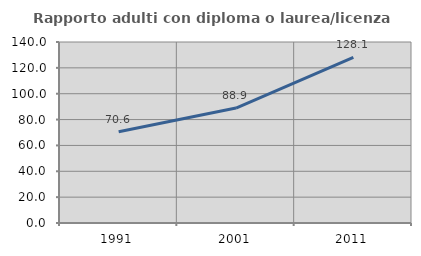
| Category | Rapporto adulti con diploma o laurea/licenza media  |
|---|---|
| 1991.0 | 70.649 |
| 2001.0 | 88.936 |
| 2011.0 | 128.121 |